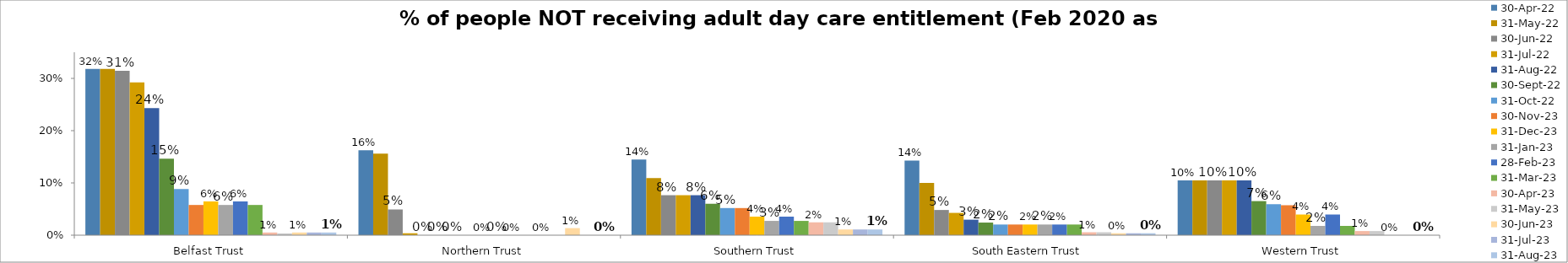
| Category | 30-Apr-22 | 31-May-22 | 30-Jun-22 | 31-Jul-22 | 31-Aug-22 | 30-Sep-22 | 31-Oct-22 | 30-Nov-23 | 31-Dec-23 | 31-Jan-23 | 28-Feb-23 | 31-Mar-23 | 30-Apr-23 | 31-May-23 | 30-Jun-23 | 31-Jul-23 | 31-Aug-23 |
|---|---|---|---|---|---|---|---|---|---|---|---|---|---|---|---|---|---|
| Belfast Trust | 0.318 | 0.318 | 0.315 | 0.293 | 0.243 | 0.146 | 0.088 | 0.058 | 0.065 | 0.058 | 0.065 | 0.058 | 0.005 | 0.003 | 0.005 | 0.005 | 0.005 |
| Northern Trust | 0.162 | 0.156 | 0.049 | 0.004 | 0 | 0 | 0 | 0 | 0 | 0 | 0 | 0 | 0 | 0 | 0.014 | 0 | 0 |
| Southern Trust | 0.145 | 0.109 | 0.077 | 0.077 | 0.077 | 0.06 | 0.052 | 0.052 | 0.036 | 0.027 | 0.036 | 0.027 | 0.025 | 0.025 | 0.011 | 0.011 | 0.011 |
| South Eastern Trust | 0.143 | 0.1 | 0.048 | 0.043 | 0.03 | 0.024 | 0.02 | 0.02 | 0.02 | 0.02 | 0.02 | 0.02 | 0.006 | 0.006 | 0.004 | 0.004 | 0.004 |
| Western Trust | 0.105 | 0.105 | 0.105 | 0.105 | 0.105 | 0.065 | 0.059 | 0.057 | 0.04 | 0.018 | 0.04 | 0.018 | 0.008 | 0.008 | 0 | 0 | 0 |